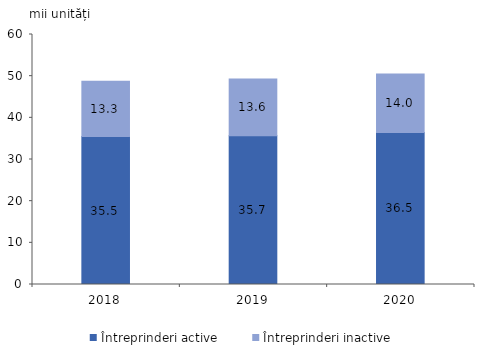
| Category | Întreprinderi active | Întreprinderi inactive |
|---|---|---|
| 2018.0 | 35.5 | 13.3 |
| 2019.0 | 35.7 | 13.6 |
| 2020.0 | 36.5 | 14 |